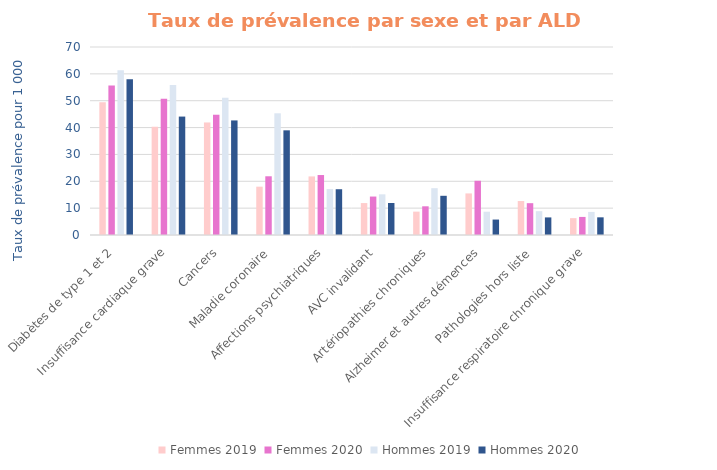
| Category | Femmes 2019 | Femmes 2020 | Hommes 2019 | Hommes 2020 |
|---|---|---|---|---|
| Diabètes de type 1 et 2 | 49.471 | 55.643 | 61.298 | 57.947 |
| Insuffisance cardiaque grave | 40.309 | 50.772 | 55.86 | 44.096 |
| Cancers | 41.908 | 44.781 | 51.079 | 42.661 |
| Maladie coronaire | 17.996 | 21.864 | 45.313 | 38.974 |
| Affections psychiatriques | 21.813 | 22.326 | 17.105 | 17.041 |
| AVC invalidant | 11.894 | 14.318 | 15.148 | 11.919 |
| Artériopathies chroniques | 8.701 | 10.687 | 17.428 | 14.598 |
| Alzheimer et autres démences | 15.484 | 20.193 | 8.669 | 5.749 |
| Pathologies hors liste | 12.641 | 11.848 | 8.871 | 6.548 |
| Insuffisance respiratoire chronique grave | 6.278 | 6.729 | 8.59 | 6.578 |